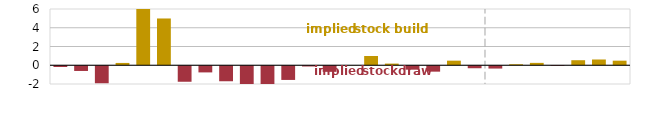
| Category | Series 2 | Series 0 |
|---|---|---|
| 2019-Q1 | -0.186 | 0 |
| 2019-Q2 | -0.61 | 0 |
| 2019-Q3 | -1.919 | 0 |
| 2019-Q4 | 0 | 0.247 |
| 2020-Q1 | 0 | 6.66 |
| 2020-Q2 | 0 | 4.989 |
| 2020-Q3 | -1.761 | 0 |
| 2020-Q4 | -0.763 | 0 |
| 2021-Q1 | -1.707 | 0 |
| 2021-Q2 | -2.287 | 0 |
| 2021-Q3 | -2.166 | 0 |
| 2021-Q4 | -1.566 | 0 |
| 2022-Q1 | -0.133 | 0 |
| 2022-Q2 | -0.704 | 0 |
| 2022-Q3 | 0 | 0.015 |
| 2022-Q4 | 0 | 0.99 |
| 2023-Q1 | 0 | 0.175 |
| 2023-Q2 | -0.473 | 0 |
| 2023-Q3 | -0.684 | 0 |
| 2023-Q4 | 0 | 0.488 |
| 2024-Q1 | -0.319 | 0 |
| 2024-Q2 | -0.353 | 0 |
| 2024-Q3 | 0 | 0.107 |
| 2024-Q4 | 0 | 0.253 |
| 2025-Q1 | -0.071 | 0 |
| 2025-Q2 | 0 | 0.537 |
| 2025-Q3 | 0 | 0.613 |
| 2025-Q4 | 0 | 0.488 |